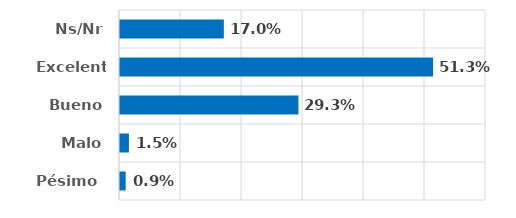
| Category | Series 0 |
|---|---|
| Pésimo  | 0.009 |
| Malo | 0.015 |
| Bueno | 0.293 |
| Excelente | 0.513 |
| Ns/Nr | 0.17 |